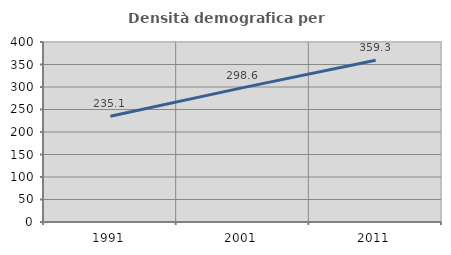
| Category | Densità demografica |
|---|---|
| 1991.0 | 235.066 |
| 2001.0 | 298.602 |
| 2011.0 | 359.269 |